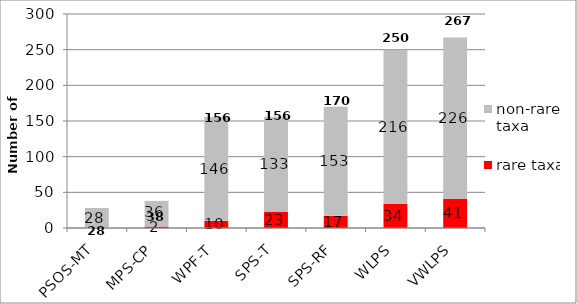
| Category | rare taxa | non-rare taxa |
|---|---|---|
| PSOS-MT | 0 | 28 |
| MPS-CP | 2 | 36 |
| WPF-T | 10 | 146 |
| SPS-T | 23 | 133 |
| SPS-RF | 17 | 153 |
| WLPS | 34 | 216 |
| VWLPS | 41 | 226 |